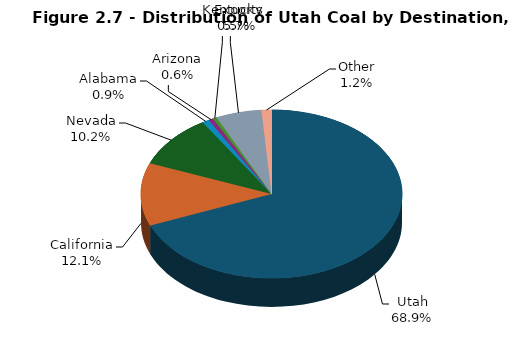
| Category | Series 0 |
|---|---|
| Utah | 13117 |
| California | 2297 |
| Nevada | 1942 |
| Alabama | 166 |
| Arizona | 110 |
| Kentucky | 91 |
| Exports | 1080.7 |
| Other | 235 |